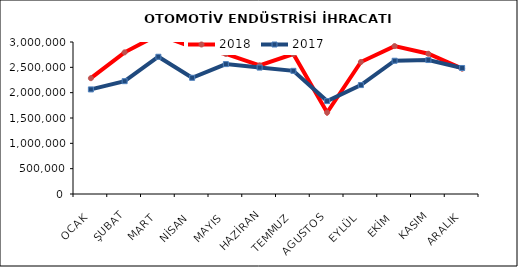
| Category | 2018 | 2017 |
|---|---|---|
| OCAK | 2285575.336 | 2064101.663 |
| ŞUBAT | 2795909.433 | 2227157.127 |
| MART | 3144201.021 | 2708819.414 |
| NİSAN | 2902144.521 | 2293507.187 |
| MAYIS | 2764175.18 | 2563698.714 |
| HAZİRAN | 2539981.596 | 2494969.992 |
| TEMMUZ | 2762845.318 | 2430926.166 |
| AGUSTOS | 1607708.773 | 1833654.22 |
| EYLÜL | 2605432.965 | 2149764.947 |
| EKİM | 2919511.321 | 2630083.673 |
| KASIM | 2767721.896 | 2643947.92 |
| ARALIK | 2473261.548 | 2487345.3 |